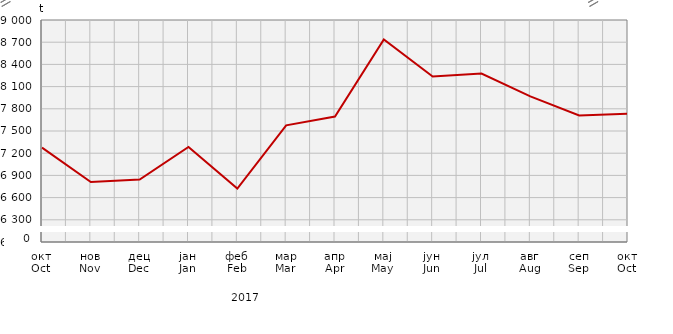
| Category | Прикупљање крављег млијека
Collecting of cow’s milk |
|---|---|
| окт
Oct | 7275 |
| нов
Nov | 6810.8 |
| дец
Dec | 6844 |
| јан
Jan | 7283.5 |
| феб
Feb | 6721.8 |
| мар
Mar | 7575.8 |
| апр
Apr | 7695.5 |
| мај
May | 8737.947 |
| јун
Jun | 8235.2 |
| јул
Jul | 8277.3 |
| авг
Aug | 7968.1 |
| сеп
Sep | 7710.9 |
| окт
Oct | 7733.7 |